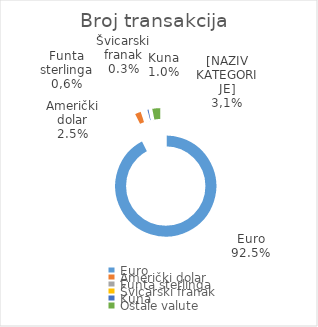
| Category | Broj transakcija  |
|---|---|
| Euro | 3823462 |
| Američki dolar | 104342 |
| Funta sterlinga | 21901 |
| Švicarski franak | 14119 |
| Kuna | 40147 |
| Ostale valute | 129379 |